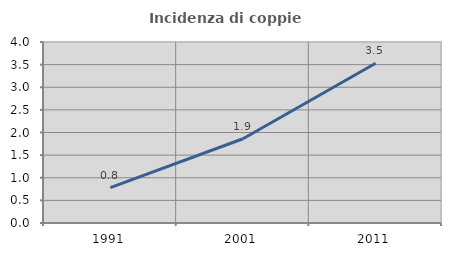
| Category | Incidenza di coppie miste |
|---|---|
| 1991.0 | 0.781 |
| 2001.0 | 1.862 |
| 2011.0 | 3.529 |